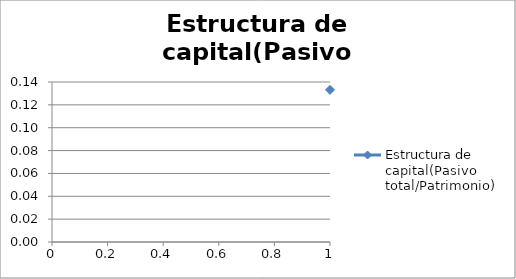
| Category | Estructura de capital(Pasivo total/Patrimonio) |
|---|---|
| 0 | 0.133 |
| 1 | 0.078 |
| 2 | 0.056 |
| 3 | 0.043 |
| 4 | 0.036 |
| 5 | 0.03 |
| 6 | 0.026 |
| 7 | 0.023 |